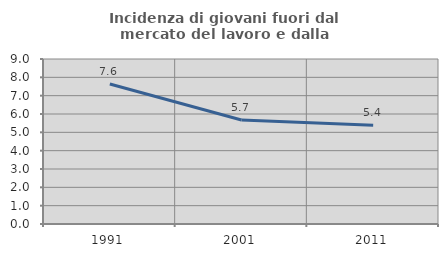
| Category | Incidenza di giovani fuori dal mercato del lavoro e dalla formazione  |
|---|---|
| 1991.0 | 7.634 |
| 2001.0 | 5.676 |
| 2011.0 | 5.383 |